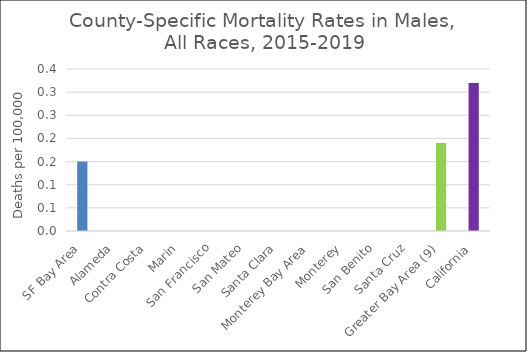
| Category | Male |
|---|---|
| SF Bay Area | 0.15 |
|   Alameda | 0 |
|   Contra Costa | 0 |
|   Marin | 0 |
|   San Francisco | 0 |
|   San Mateo | 0 |
|   Santa Clara | 0 |
| Monterey Bay Area | 0 |
|   Monterey | 0 |
|   San Benito | 0 |
|   Santa Cruz | 0 |
| Greater Bay Area (9) | 0.19 |
| California | 0.32 |